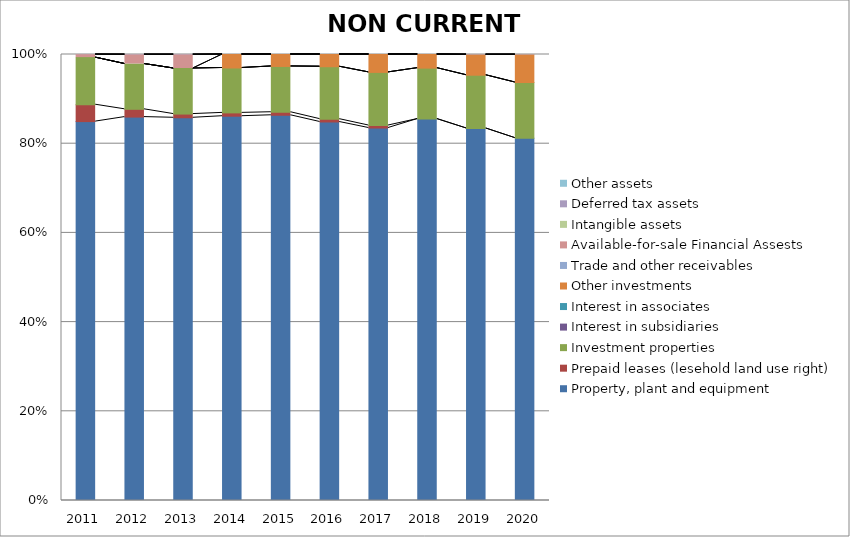
| Category | Property, plant and equipment | Prepaid leases (lesehold land use right) | Investment properties | Interest in subsidiaries | Interest in associates | Other investments | Trade and other receivables | Available-for-sale Financial Assests | Intangible assets | Deferred tax assets | Other assets |
|---|---|---|---|---|---|---|---|---|---|---|---|
| 2011.0 | 113958080 | 5079204 | 14165224 | 0 | 0 | 0 | 0 | 899820 | 0 | 36000 | 0 |
| 2012.0 | 118105558 | 2399690 | 13952841 | 0 | 0 | 0 | 0 | 2835298 | 0 | 93400 | 0 |
| 2013.0 | 115364749 | 1115385 | 13739051 | 0 | 0 | 0 | 0 | 4129169 | 0 | 88100 | 0 |
| 2014.0 | 115764999 | 1000000 | 13525260 | 0 | 0 | 4062735 | 0 | 0 | 0 | 0 | 0 |
| 2015.0 | 112004552 | 884615 | 13311470 | 0 | 0 | 3471762 | 0 | 0 | 0 | 0 | 0 |
| 2016.0 | 102498081 | 769231 | 14196926 | 0 | 0 | 3308348 | 0 | 0 | 0 | 0 | 0 |
| 2017.0 | 98005840 | 653846 | 13983132 | 0 | 0 | 4710116 | 0 | 0 | 0 | 0 | 0 |
| 2018.0 | 103163507 | 0 | 13769342 | 0 | 0 | 3686044 | 0 | 0 | 0 | 0 | 0 |
| 2019.0 | 94758649 | 0 | 13555552 | 0 | 0 | 5178572 | 0 | 0 | 0 | 95400 | 0 |
| 2020.0 | 86909803 | 0 | 13341761 | 0 | 0 | 6631419 | 0 | 0 | 0 | 87160 | 0 |